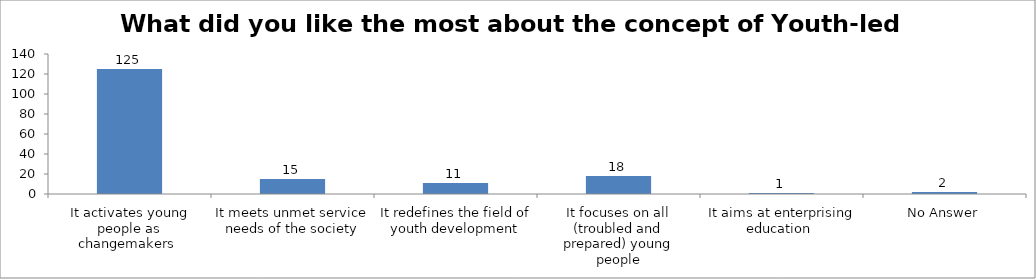
| Category | What did you like the most about the concept of Youth-led Changemaking? |
|---|---|
| It activates young people as changemakers  | 125 |
| It meets unmet service needs of the society | 15 |
| It redefines the field of youth development | 11 |
| It focuses on all (troubled and prepared) young people | 18 |
| It aims at enterprising education  | 1 |
| No Answer | 2 |